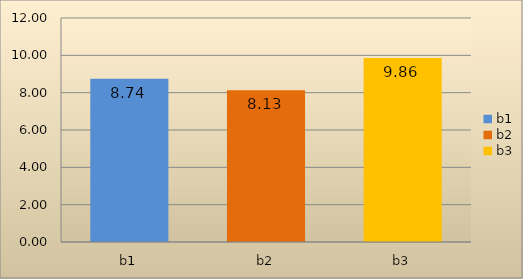
| Category | 7.5% (a1) |
|---|---|
| b1 | 8.742 |
| b2 | 8.132 |
| b3 | 9.861 |